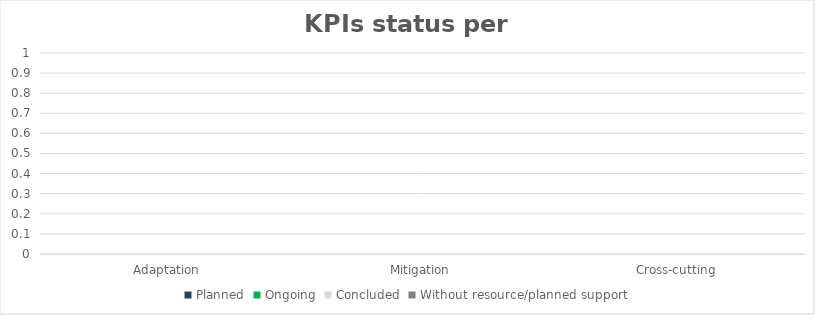
| Category | Planned | Ongoing | Concluded | Without resource/planned support |
|---|---|---|---|---|
| Adaptation | 0 | 0 | 0 | 0 |
| Mitigation | 0 | 0 | 0 | 0 |
| Cross-cutting | 0 | 0 | 0 | 0 |